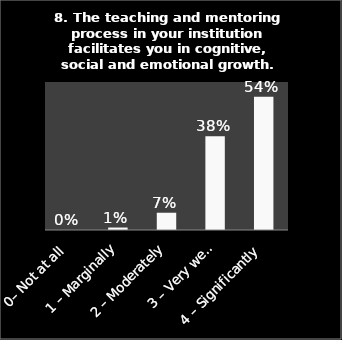
| Category | Series 0 |
|---|---|
| 0– Not at all | 0 |
| 1 – Marginally | 0.01 |
| 2 – Moderately | 0.07 |
| 3 – Very well | 0.38 |
| 4 – Significantly | 0.54 |